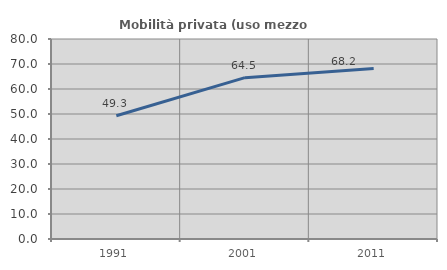
| Category | Mobilità privata (uso mezzo privato) |
|---|---|
| 1991.0 | 49.32 |
| 2001.0 | 64.535 |
| 2011.0 | 68.163 |